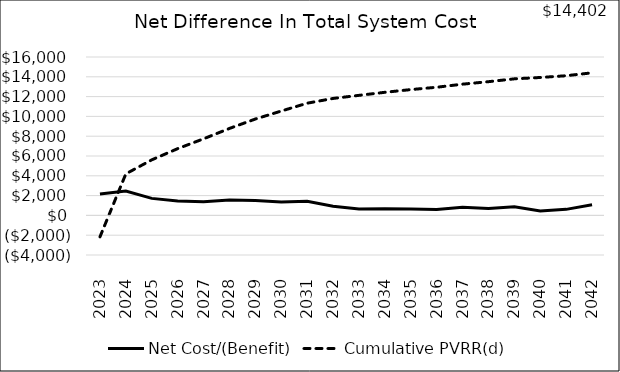
| Category | Net Cost/(Benefit) | Cumulative PVRR(d) |
|---|---|---|
| 2023.0 | 2170.629 | -2170.629 |
| 2024.0 | 2459.73 | 4195.446 |
| 2025.0 | 1719.984 | 5611.74 |
| 2026.0 | 1463.423 | 6741.211 |
| 2027.0 | 1376.109 | 7736.694 |
| 2028.0 | 1543.246 | 8783.083 |
| 2029.0 | 1497.666 | 9734.89 |
| 2030.0 | 1352.581 | 10540.59 |
| 2031.0 | 1419.508 | 11333.136 |
| 2032.0 | 918.82 | 11813.968 |
| 2033.0 | 635.007 | 12125.439 |
| 2034.0 | 669.93 | 12433.435 |
| 2035.0 | 636.648 | 12707.777 |
| 2036.0 | 584.144 | 12943.709 |
| 2037.0 | 825.199 | 13256.103 |
| 2038.0 | 705.776 | 13506.534 |
| 2039.0 | 862.743 | 13793.466 |
| 2040.0 | 440.178 | 13930.681 |
| 2041.0 | 609.436 | 14108.745 |
| 2042.0 | 1071.154 | 14402.09 |